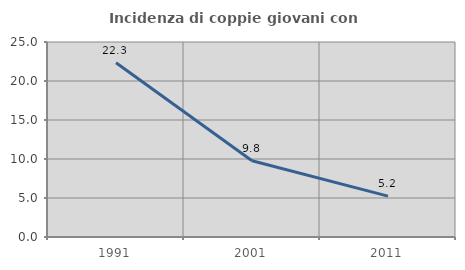
| Category | Incidenza di coppie giovani con figli |
|---|---|
| 1991.0 | 22.348 |
| 2001.0 | 9.778 |
| 2011.0 | 5.24 |